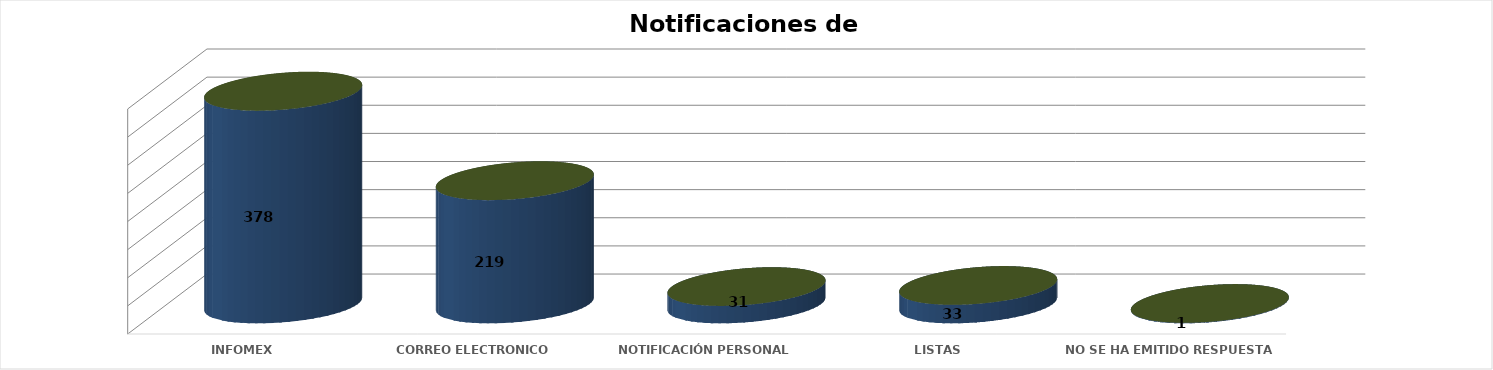
| Category | Series 0 | Series 1 | Series 2 | Series 3 | Series 4 |
|---|---|---|---|---|---|
| INFOMEX |  |  |  | 378 | 0.571 |
| CORREO ELECTRONICO |  |  |  | 219 | 0.331 |
| NOTIFICACIÓN PERSONAL |  |  |  | 31 | 0.047 |
| LISTAS |  |  |  | 33 | 0.05 |
|  NO SE HA EMITIDO RESPUESTA |  |  |  | 1 | 0.002 |